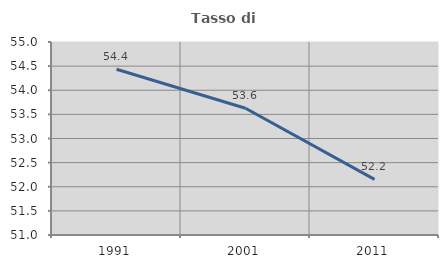
| Category | Tasso di occupazione   |
|---|---|
| 1991.0 | 54.435 |
| 2001.0 | 53.626 |
| 2011.0 | 52.154 |